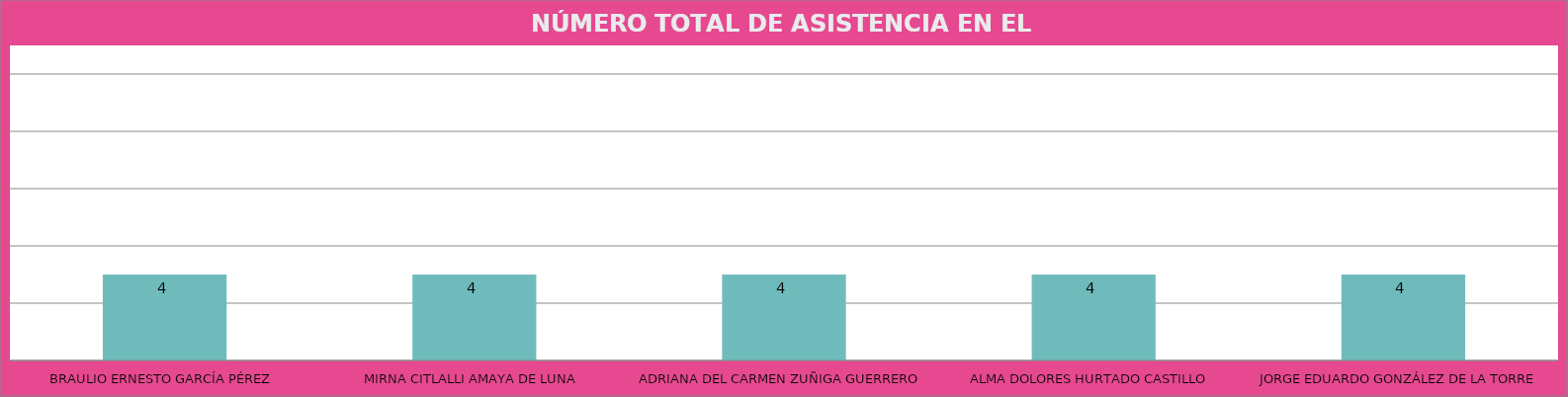
| Category | BRAULIO ERNESTO GARCÍA PÉREZ MIRNA CITLALLI AMAYA DE LUNA ADRIANA DEL CARMEN ZUÑIGA GUERRERO ALMA DOLORES HURTADO CASTILLO JORGE EDUARDO GONZÁLEZ DE LA TORRE |
|---|---|
| BRAULIO ERNESTO GARCÍA PÉREZ | 4 |
| MIRNA CITLALLI AMAYA DE LUNA | 4 |
| ADRIANA DEL CARMEN ZUÑIGA GUERRERO | 4 |
| ALMA DOLORES HURTADO CASTILLO | 4 |
| JORGE EDUARDO GONZÁLEZ DE LA TORRE | 4 |